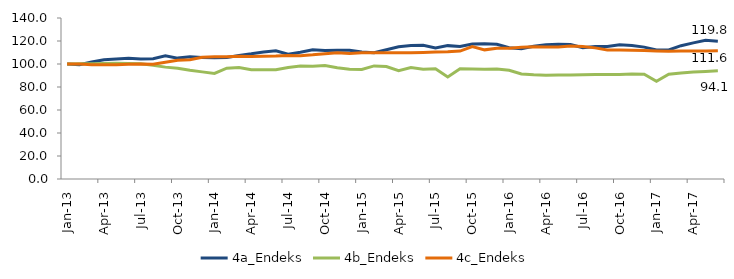
| Category | 4a_Endeks | 4b_Endeks | 4c_Endeks |
|---|---|---|---|
| 2013-01-01 | 100 | 100 | 100 |
| 2013-02-01 | 99.341 | 100.186 | 100.103 |
| 2013-03-01 | 101.699 | 100.316 | 99.376 |
| 2013-04-01 | 103.715 | 100.44 | 99.308 |
| 2013-05-01 | 104.428 | 100.593 | 99.354 |
| 2013-06-01 | 104.927 | 100.359 | 99.825 |
| 2013-07-01 | 104.291 | 100.235 | 100.034 |
| 2013-08-01 | 104.606 | 98.919 | 99.816 |
| 2013-09-01 | 107.058 | 97.279 | 101.465 |
| 2013-10-01 | 105.121 | 96.391 | 103.332 |
| 2013-11-01 | 106.291 | 94.505 | 103.676 |
| 2013-12-01 | 105.691 | 93.157 | 105.779 |
| 2014-01-01 | 105.394 | 91.809 | 106.405 |
| 2014-02-01 | 105.621 | 96.342 | 106.324 |
| 2014-03-01 | 107.422 | 96.881 | 106.808 |
| 2014-04-01 | 108.822 | 94.985 | 106.63 |
| 2014-05-01 | 110.468 | 94.991 | 106.797 |
| 2014-06-01 | 111.423 | 95.048 | 106.9 |
| 2014-07-01 | 108.578 | 97.037 | 107.377 |
| 2014-08-01 | 110.144 | 98.176 | 107.181 |
| 2014-09-01 | 112.457 | 98.105 | 107.944 |
| 2014-10-01 | 111.75 | 98.688 | 109.01 |
| 2014-11-01 | 111.99 | 96.8 | 109.792 |
| 2014-12-01 | 111.927 | 95.408 | 109.034 |
| 2015-01-01 | 110.39 | 95.212 | 109.696 |
| 2015-02-01 | 109.858 | 98.341 | 109.798 |
| 2015-03-01 | 112.398 | 97.783 | 109.691 |
| 2015-04-01 | 114.992 | 94.11 | 109.772 |
| 2015-05-01 | 116.136 | 97.001 | 109.771 |
| 2015-06-01 | 116.229 | 95.486 | 110.077 |
| 2015-07-01 | 113.85 | 95.779 | 110.496 |
| 2015-08-01 | 115.972 | 88.733 | 110.564 |
| 2015-09-01 | 115.313 | 95.871 | 111.229 |
| 2015-10-01 | 117.465 | 95.632 | 115.106 |
| 2015-11-01 | 117.589 | 95.515 | 112.299 |
| 2015-12-01 | 117.231 | 95.591 | 113.643 |
| 2016-01-01 | 114.144 | 94.602 | 113.723 |
| 2016-02-01 | 113.342 | 91.378 | 114.666 |
| 2016-03-01 | 115.432 | 90.561 | 115.02 |
| 2016-04-01 | 116.822 | 90.152 | 114.769 |
| 2016-05-01 | 117.084 | 90.532 | 114.842 |
| 2016-06-01 | 117 | 90.422 | 115.564 |
| 2016-07-01 | 114.224 | 90.567 | 115.133 |
| 2016-08-01 | 115.159 | 90.767 | 114.028 |
| 2016-09-01 | 115.153 | 90.854 | 112.174 |
| 2016-10-01 | 116.776 | 90.934 | 112.226 |
| 2016-11-01 | 116.121 | 91.325 | 111.9 |
| 2016-12-01 | 114.684 | 91.154 | 111.757 |
| 2017-01-01 | 112.121 | 85.031 | 111.361 |
| 2017-02-01 | 112.207 | 91.066 | 111.141 |
| 2017-03-01 | 115.907 | 92.252 | 111.35 |
| 2017-04-01 | 118.39 | 93.129 | 111.317 |
| 2017-05-01 | 120.58 | 93.519 | 111.341 |
| 2017-06-01 | 119.763 | 94.111 | 111.573 |